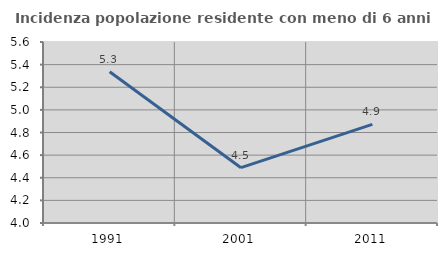
| Category | Incidenza popolazione residente con meno di 6 anni |
|---|---|
| 1991.0 | 5.337 |
| 2001.0 | 4.489 |
| 2011.0 | 4.871 |